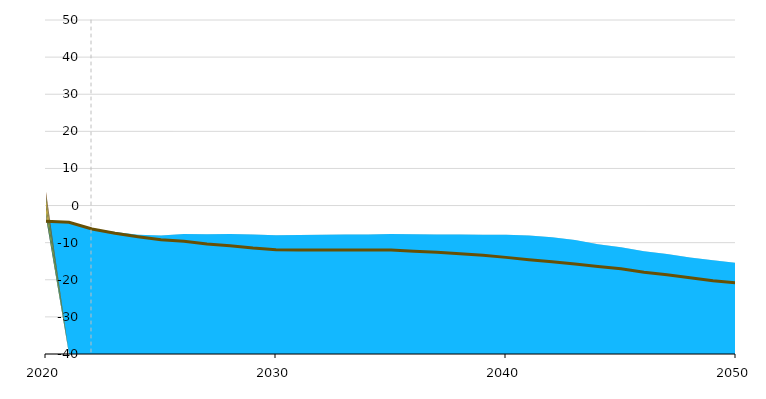
| Category | Middle East Ref |
|---|---|
| 2020.0 | -4.25 |
| 2021.0 | -4.524 |
| 2022.0 | -6.299 |
| 2023.0 | -7.478 |
| 2024.0 | -8.426 |
| 2025.0 | -9.242 |
| 2026.0 | -9.623 |
| 2027.0 | -10.337 |
| 2028.0 | -10.862 |
| 2029.0 | -11.445 |
| 2030.0 | -11.887 |
| 2031.0 | -11.95 |
| 2032.0 | -11.963 |
| 2033.0 | -11.954 |
| 2034.0 | -11.959 |
| 2035.0 | -12.001 |
| 2036.0 | -12.282 |
| 2037.0 | -12.567 |
| 2038.0 | -12.97 |
| 2039.0 | -13.408 |
| 2040.0 | -13.962 |
| 2041.0 | -14.583 |
| 2042.0 | -15.159 |
| 2043.0 | -15.767 |
| 2044.0 | -16.423 |
| 2045.0 | -17.048 |
| 2046.0 | -17.944 |
| 2047.0 | -18.618 |
| 2048.0 | -19.448 |
| 2049.0 | -20.245 |
| 2050.0 | -20.849 |